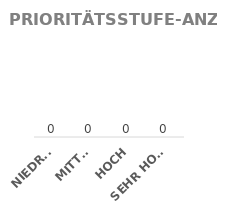
| Category | MENGE |
|---|---|
| NIEDRIG | 0 |
| MITTEL | 0 |
| HOCH | 0 |
| SEHR HOCH | 0 |